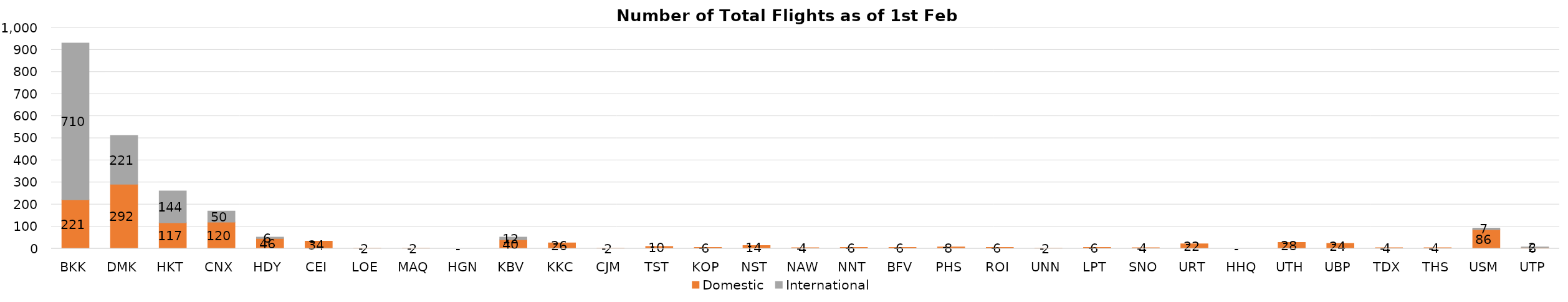
| Category | Domestic | International |
|---|---|---|
| BKK | 221 | 710 |
| DMK | 292 | 221 |
| HKT | 117 | 144 |
| CNX | 120 | 50 |
| HDY | 46 | 6 |
| CEI | 34 | 0 |
| LOE | 2 | 0 |
| MAQ | 2 | 0 |
| HGN | 0 | 0 |
| KBV | 40 | 12 |
| KKC | 26 | 0 |
| CJM | 2 | 0 |
| TST | 10 | 0 |
| KOP | 6 | 0 |
| NST | 14 | 0 |
| NAW | 4 | 0 |
| NNT | 6 | 0 |
| BFV | 6 | 0 |
| PHS | 8 | 0 |
| ROI | 6 | 0 |
| UNN | 2 | 0 |
| LPT | 6 | 0 |
| SNO | 4 | 0 |
| URT | 22 | 0 |
| HHQ | 0 | 0 |
| UTH | 28 | 0 |
| UBP | 24 | 0 |
| TDX | 4 | 0 |
| THS | 4 | 0 |
| USM | 86 | 7 |
| UTP | 6 | 2 |